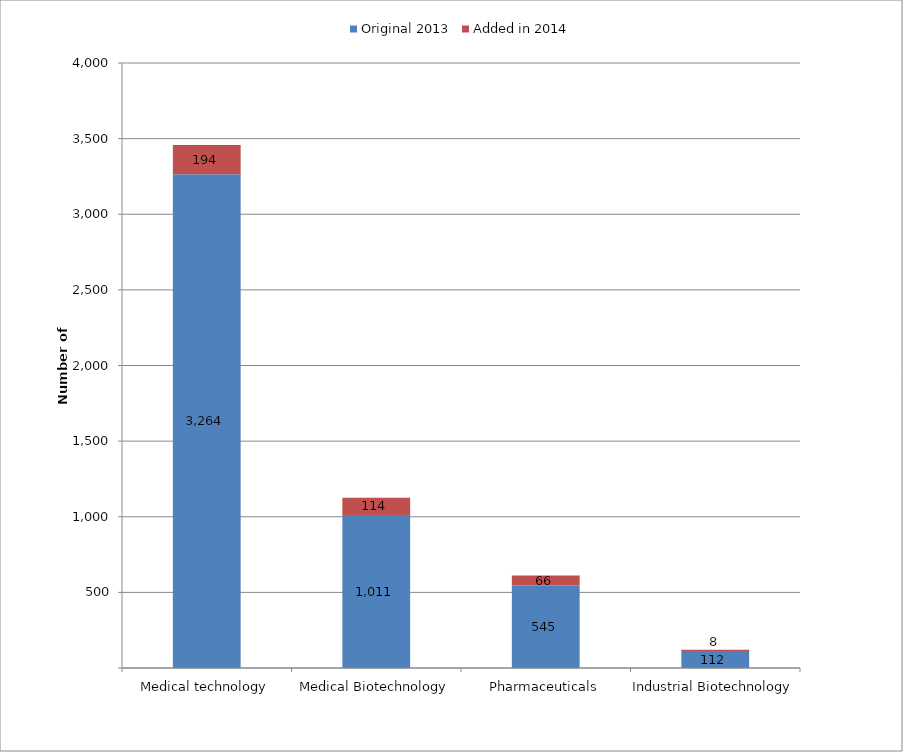
| Category | Original 2013 | Added in 2014 |
|---|---|---|
| Medical technology | 3264 | 194 |
| Medical Biotechnology | 1011 | 114 |
| Pharmaceuticals | 545 | 66 |
| Industrial Biotechnology | 112 | 8 |